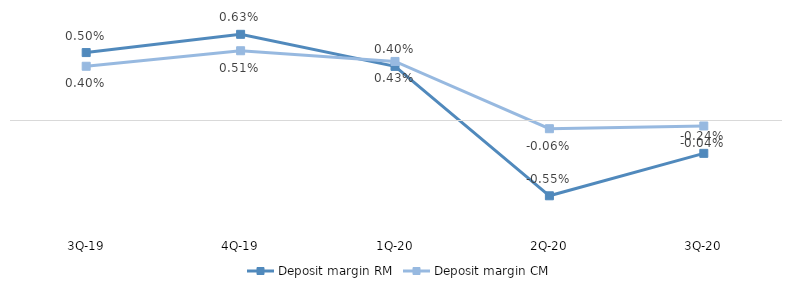
| Category | Deposit margin RM | Deposit margin CM |
|---|---|---|
| 3Q-20 | -0.002 | 0 |
| 2Q-20 | -0.006 | -0.001 |
| 1Q-20 | 0.004 | 0.004 |
| 4Q-19 | 0.006 | 0.005 |
| 3Q-19 | 0.005 | 0.004 |